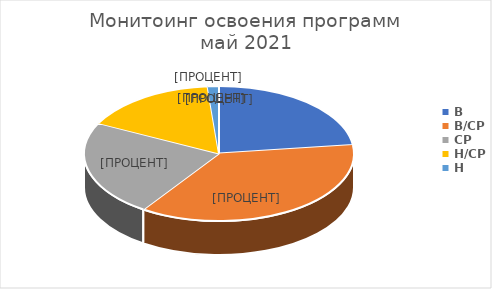
| Category | Series 0 |
|---|---|
| В | 17 |
| В/СР | 27 |
| СР | 17 |
| Н/СР | 12 |
| Н | 1 |